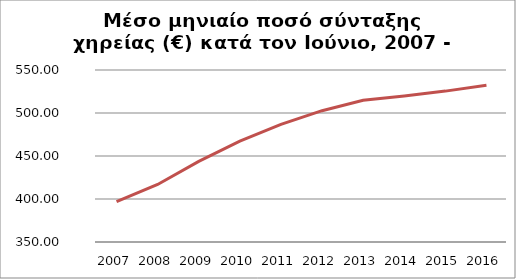
| Category | Series 1 |
|---|---|
| 2007.0 | 396.928 |
| 2008.0 | 416.865 |
| 2009.0 | 443.721 |
| 2010.0 | 467.367 |
| 2011.0 | 486.787 |
| 2012.0 | 502.695 |
| 2013.0 | 514.839 |
| 2014.0 | 519.7 |
| 2015.0 | 525.45 |
| 2016.0 | 532.34 |